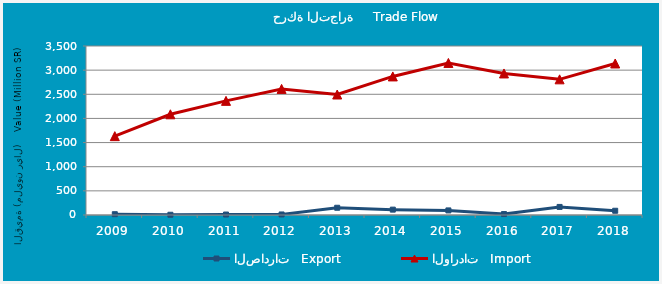
| Category | الصادرات   Export | الواردات   Import |
|---|---|---|
| 2009.0 | 16561622 | 1632975835 |
| 2010.0 | 5060935 | 2085454292 |
| 2011.0 | 9674971 | 2363724280 |
| 2012.0 | 11138308 | 2611178110 |
| 2013.0 | 150026178 | 2495529003 |
| 2014.0 | 111201057 | 2869779629 |
| 2015.0 | 94996742 | 3149109769 |
| 2016.0 | 19439242 | 2931268488 |
| 2017.0 | 167206465 | 2809662576 |
| 2018.0 | 87810394 | 3137877530 |